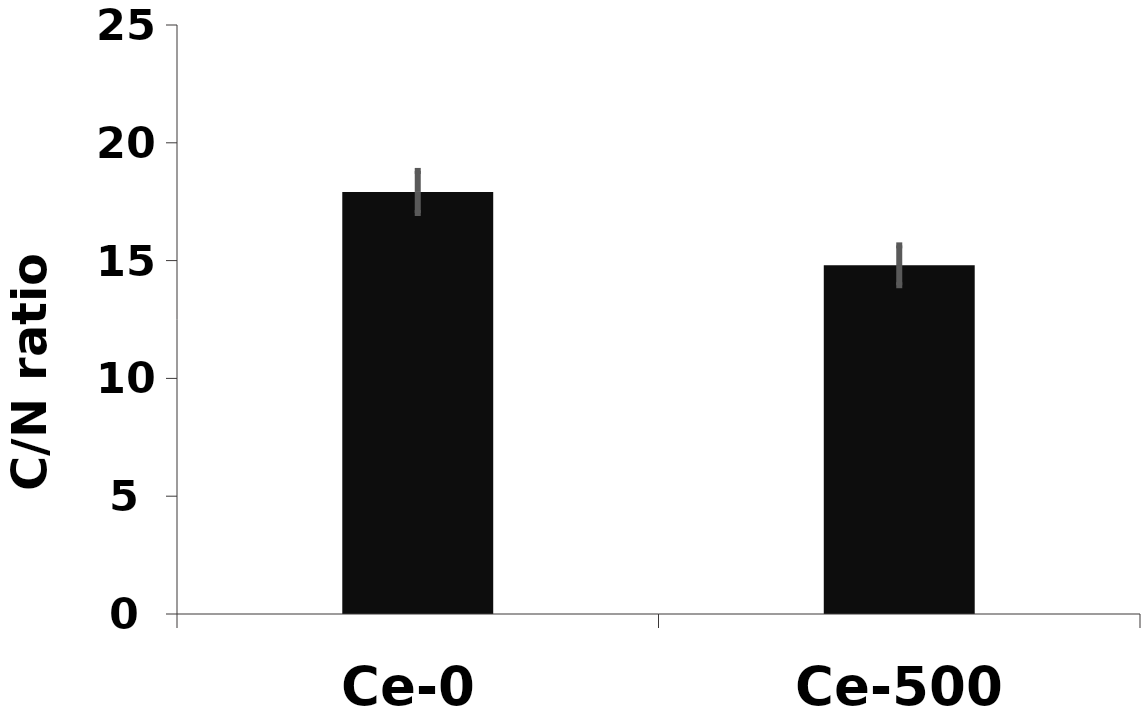
| Category | C/N |
|---|---|
| Ce-0 | 17.914 |
| Ce-500 | 14.801 |